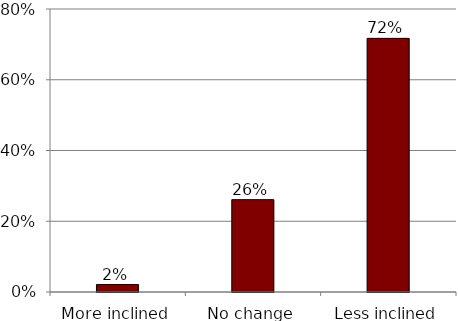
| Category | Series 0 |
|---|---|
| More inclined | 0.021 |
| No change | 0.261 |
| Less inclined | 0.717 |